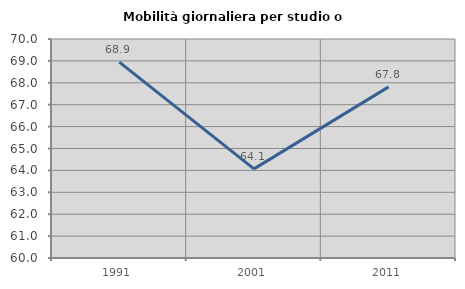
| Category | Mobilità giornaliera per studio o lavoro |
|---|---|
| 1991.0 | 68.944 |
| 2001.0 | 64.069 |
| 2011.0 | 67.813 |